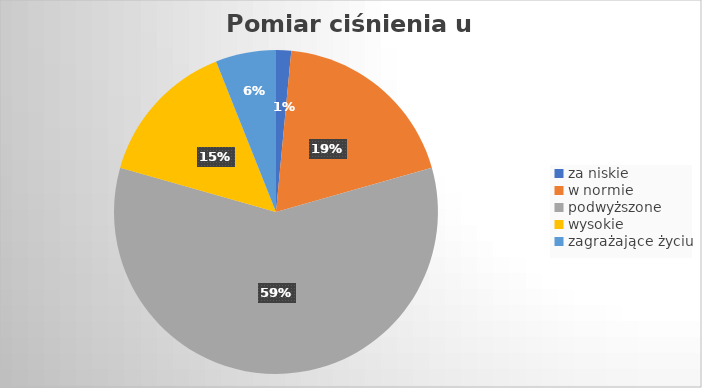
| Category | Series 0 |
|---|---|
| za niskie | 1.508 |
| w normie | 19.095 |
| podwyższone | 58.794 |
| wysokie | 14.573 |
| zagrażające życiu | 6.03 |